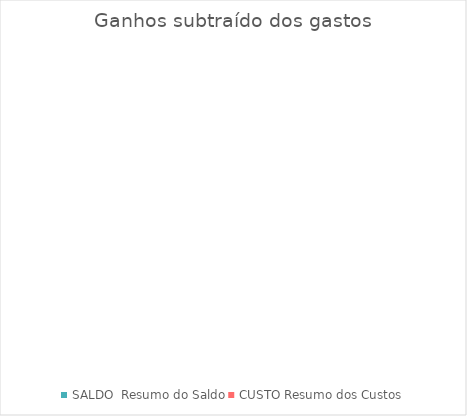
| Category | Series 0 | Series 1 |
|---|---|---|
| 0 |  | 0 |
| 1 |  | 0 |